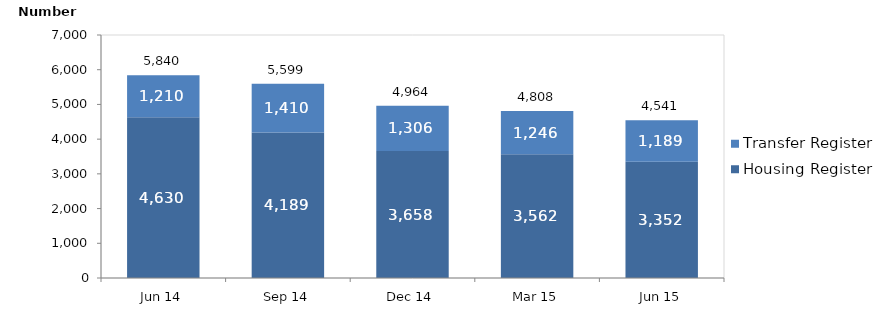
| Category | Housing Register | Transfer Register |
|---|---|---|
| Jun 14 | 4630 | 1210 |
| Sep 14 | 4189 | 1410 |
| Dec 14 | 3658 | 1306 |
| Mar 15 | 3562 | 1246 |
| Jun 15 | 3352 | 1189 |